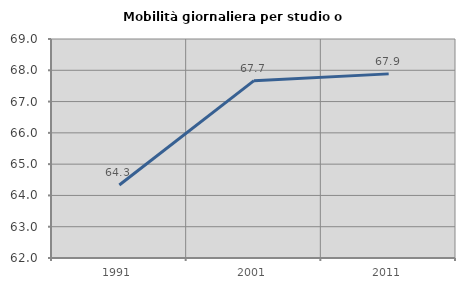
| Category | Mobilità giornaliera per studio o lavoro |
|---|---|
| 1991.0 | 64.335 |
| 2001.0 | 67.669 |
| 2011.0 | 67.885 |